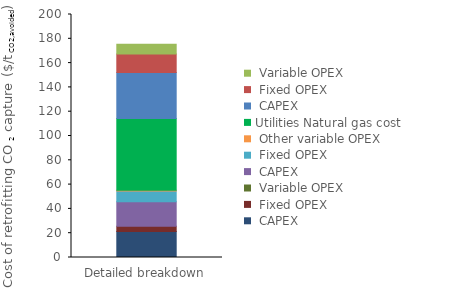
| Category | Interconnecting | Utilities | Series 0 | Series 1 | Series 2 |
|---|---|---|---|---|---|
| 0 | 0 | 59.049 | 37.915 | 15.081 | 8.182 |